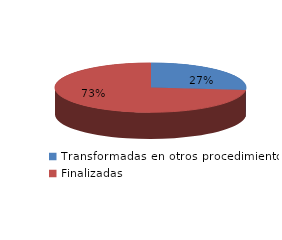
| Category | Series 0 |
|---|---|
| Transformadas en otros procedimientos | 5010 |
| Finalizadas | 13821 |